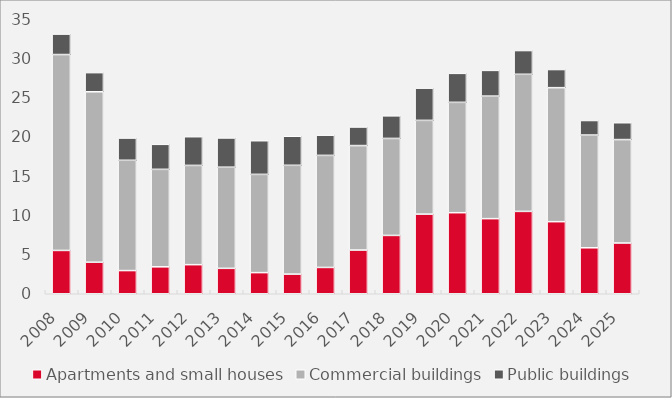
| Category | Apartments and small houses | Commercial buildings | Public buildings |
|---|---|---|---|
| 2008.0 | 5.514 | 24.932 | 2.603 |
| 2009.0 | 4.011 | 21.695 | 2.436 |
| 2010.0 | 2.951 | 14.037 | 2.829 |
| 2011.0 | 3.428 | 12.407 | 3.181 |
| 2012.0 | 3.701 | 12.634 | 3.651 |
| 2013.0 | 3.235 | 12.872 | 3.721 |
| 2014.0 | 2.691 | 12.503 | 4.282 |
| 2015.0 | 2.501 | 13.848 | 3.696 |
| 2016.0 | 3.348 | 14.261 | 2.571 |
| 2017.0 | 5.564 | 13.294 | 2.363 |
| 2018.0 | 7.425 | 12.342 | 2.878 |
| 2019.0 | 10.136 | 11.931 | 4.101 |
| 2020.0 | 10.315 | 14.047 | 3.69 |
| 2021.0 | 9.559 | 15.596 | 3.274 |
| 2022.0 | 10.484 | 17.448 | 3.02 |
| 2023.0 | 9.175 | 17.055 | 2.307 |
| 2024.0 | 5.852 | 14.348 | 1.849 |
| 2025.0 | 6.461 | 13.163 | 2.143 |